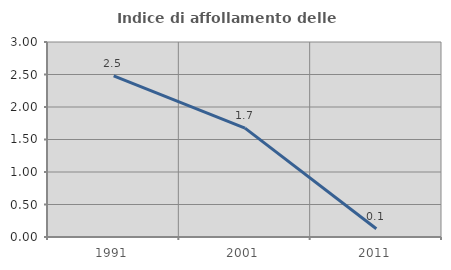
| Category | Indice di affollamento delle abitazioni  |
|---|---|
| 1991.0 | 2.479 |
| 2001.0 | 1.675 |
| 2011.0 | 0.126 |